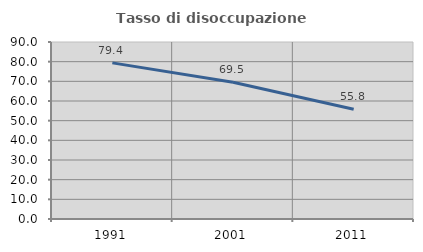
| Category | Tasso di disoccupazione giovanile  |
|---|---|
| 1991.0 | 79.395 |
| 2001.0 | 69.54 |
| 2011.0 | 55.774 |